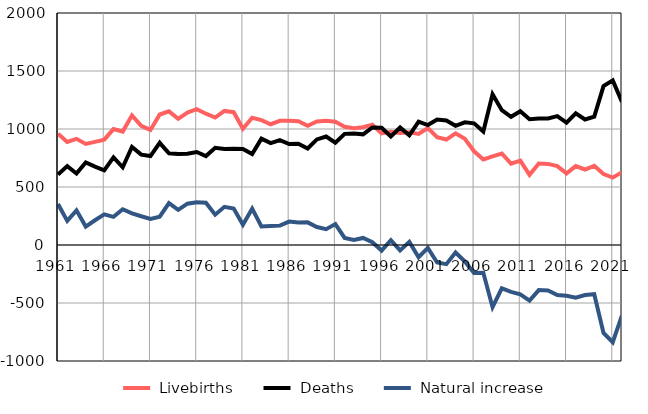
| Category |  Livebirths |  Deaths |  Natural increase |
|---|---|---|---|
| 1961.0 | 960 | 607 | 353 |
| 1962.0 | 888 | 680 | 208 |
| 1963.0 | 915 | 616 | 299 |
| 1964.0 | 871 | 712 | 159 |
| 1965.0 | 889 | 676 | 213 |
| 1966.0 | 908 | 644 | 264 |
| 1967.0 | 999 | 756 | 243 |
| 1968.0 | 978 | 670 | 308 |
| 1969.0 | 1118 | 845 | 273 |
| 1970.0 | 1027 | 779 | 248 |
| 1971.0 | 992 | 767 | 225 |
| 1972.0 | 1125 | 881 | 244 |
| 1973.0 | 1152 | 791 | 361 |
| 1974.0 | 1088 | 785 | 303 |
| 1975.0 | 1142 | 786 | 356 |
| 1976.0 | 1171 | 802 | 369 |
| 1977.0 | 1132 | 767 | 365 |
| 1978.0 | 1099 | 838 | 261 |
| 1979.0 | 1156 | 827 | 329 |
| 1980.0 | 1145 | 830 | 315 |
| 1981.0 | 1002 | 827 | 175 |
| 1982.0 | 1097 | 784 | 313 |
| 1983.0 | 1077 | 917 | 160 |
| 1984.0 | 1041 | 878 | 163 |
| 1985.0 | 1071 | 904 | 167 |
| 1986.0 | 1072 | 870 | 202 |
| 1987.0 | 1067 | 873 | 194 |
| 1988.0 | 1027 | 832 | 195 |
| 1989.0 | 1065 | 910 | 155 |
| 1990.0 | 1071 | 935 | 136 |
| 1991.0 | 1062 | 882 | 180 |
| 1992.0 | 1019 | 958 | 61 |
| 1993.0 | 1006 | 962 | 44 |
| 1994.0 | 1015 | 954 | 61 |
| 1995.0 | 1037 | 1013 | 24 |
| 1996.0 | 962 | 1010 | -48 |
| 1997.0 | 977 | 936 | 41 |
| 1998.0 | 966 | 1013 | -47 |
| 1999.0 | 972 | 945 | 27 |
| 2000.0 | 958 | 1063 | -105 |
| 2001.0 | 1009 | 1034 | -25 |
| 2002.0 | 930 | 1081 | -151 |
| 2003.0 | 909 | 1074 | -165 |
| 2004.0 | 963 | 1028 | -65 |
| 2005.0 | 916 | 1058 | -142 |
| 2006.0 | 808 | 1049 | -241 |
| 2007.0 | 738 | 978 | -240 |
| 2008.0 | 764 | 1300 | -536 |
| 2009.0 | 789 | 1162 | -373 |
| 2010.0 | 701 | 1105 | -404 |
| 2011.0 | 728 | 1153 | -425 |
| 2012.0 | 605 | 1084 | -479 |
| 2013.0 | 702 | 1091 | -389 |
| 2014.0 | 699 | 1091 | -392 |
| 2015.0 | 680 | 1111 | -431 |
| 2016.0 | 617 | 1054 | -437 |
| 2017.0 | 680 | 1135 | -455 |
| 2018.0 | 651 | 1082 | -431 |
| 2019.0 | 683 | 1107 | -424 |
| 2020.0 | 612 | 1370 | -758 |
| 2021.0 | 581 | 1419 | -838 |
| 2022.0 | 628 | 1234 | -606 |